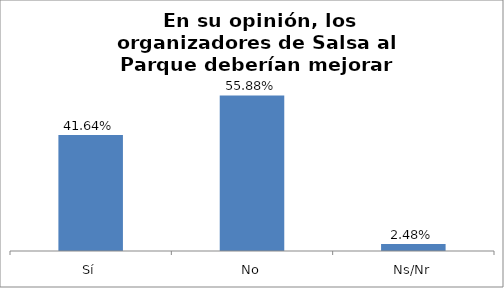
| Category | Total |
|---|---|
| Sí | 0.416 |
| No | 0.559 |
| Ns/Nr | 0.025 |